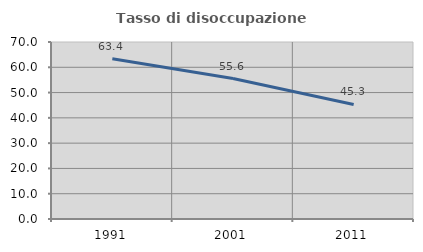
| Category | Tasso di disoccupazione giovanile  |
|---|---|
| 1991.0 | 63.37 |
| 2001.0 | 55.556 |
| 2011.0 | 45.289 |